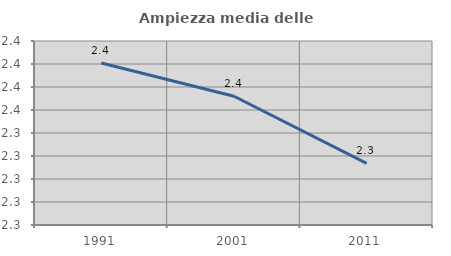
| Category | Ampiezza media delle famiglie |
|---|---|
| 1991.0 | 2.401 |
| 2001.0 | 2.372 |
| 2011.0 | 2.314 |